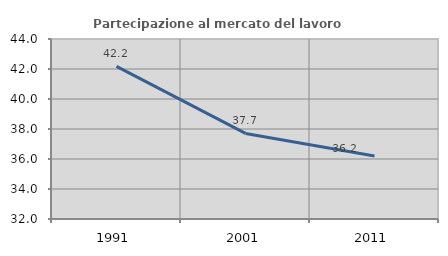
| Category | Partecipazione al mercato del lavoro  femminile |
|---|---|
| 1991.0 | 42.171 |
| 2001.0 | 37.706 |
| 2011.0 | 36.201 |